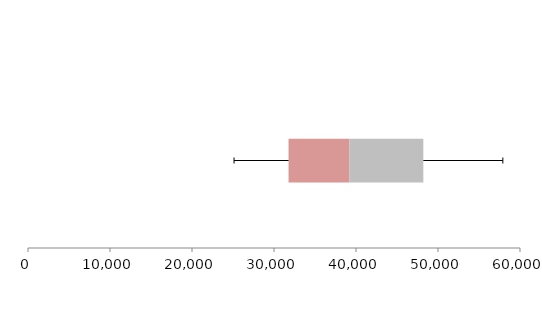
| Category | Series 1 | Series 2 | Series 3 |
|---|---|---|---|
| 0 | 31775.071 | 7418.694 | 9017.148 |